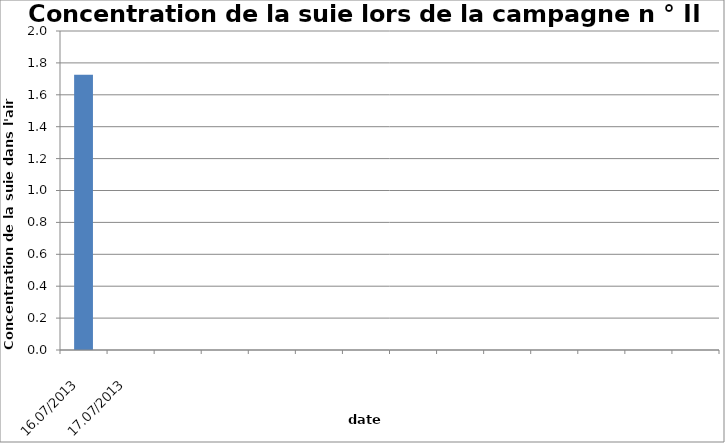
| Category | Series 0 |
|---|---|
| 16.07/2013 | 1.725 |
| 17.07/2013 | 0 |